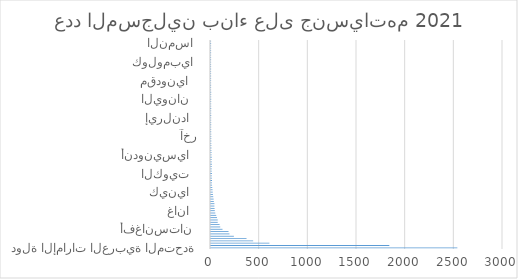
| Category | عدد المسجلين بناء على جنسياتهم |
|---|---|
| دولة الإمارات العربية المتحدة | 2531 |
| الهند   | 1832 |
| باكستان   | 600 |
| مصر   | 433 |
| الفليبين   | 365 |
| بنغلاديش  | 235 |
| نيبال   | 190 |
| سوريا   | 180 |
| أفغانستان  | 118 |
| الأردن   | 95 |
| السودان   | 88 |
| المغرب   | 69 |
| عُمان   | 69 |
| جزر القمر  | 62 |
| سريلانكا   | 54 |
| فلسطين   | 44 |
| غانا   | 39 |
| المملكة المتحدة   | 37 |
| نيجيريا   | 35 |
| لبنان   | 35 |
| تونس   | 29 |
| جمهورية الصين الشعبية  | 27 |
| اليمن   | 23 |
| العراق   | 20 |
| كينيا   | 18 |
| كاميرون  | 16 |
| إيران   | 13 |
| المملكة العربية السعودية   | 11 |
| إيطاليا   | 10 |
| أوغندا   | 10 |
| تركيا   | 10 |
| جنوب أفريقيا   | 9 |
| الكويت   | 9 |
| الجزائر | 8 |
| تايلندا   | 8 |
| كندا  | 8 |
| كوريا الجنوبية   | 8 |
| روسيا   | 8 |
| البحرين  | 7 |
| أثيوبيا | 7 |
| أندونيسيا   | 6 |
| الولايات المتحدة   | 6 |
| أستراليا  | 4 |
| زمبابوي   | 4 |
| قطر   | 4 |
| ميانمار   | 3 |
| فرنسا   | 3 |
| إسبانيا   | 3 |
| آخر | 3 |
| ألمانيا   | 3 |
| الدانمارك   | 2 |
| السنغال   | 2 |
| السويد   | 2 |
| اليابان   | 2 |
| إريتريا   | 2 |
| أوكرانيا   | 2 |
| إيرلندا   | 2 |
| فيتنام   | 2 |
| رومانيا   | 2 |
| سنغافورة   | 2 |
| سويسرا   | 2 |
| سيراليون   | 2 |
| ساحل العاج  | 2 |
| رواندا   | 2 |
| اليونان   | 2 |
| نيوزيلندا   | 2 |
| هولندا   | 2 |
| قيرغيزستان   | 2 |
| كازاخستان   | 1 |
| مالطا   | 1 |
| ماليزيا   | 1 |
| مدغشقر   | 1 |
| مقدونيا   | 1 |
| بلجيكا  | 1 |
| بلغاريا  | 1 |
| ترينيداد وتوباغو   | 1 |
| تنزانيا   | 1 |
| سانت كيتس ونيفس   | 1 |
| سانت هيلانة | 1 |
| شيلي  | 1 |
| كولومبيا  | 1 |
| البرازيل  | 1 |
| البرتغال   | 1 |
| أنغولا  | 1 |
| أوزباكستان   | 1 |
| إكوادور   | 1 |
| ألبانيا  | 1 |
| النرويج   | 1 |
| النمسا  | 1 |
| المكسيك   | 1 |